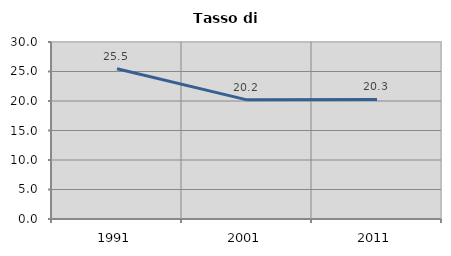
| Category | Tasso di disoccupazione   |
|---|---|
| 1991.0 | 25.463 |
| 2001.0 | 20.195 |
| 2011.0 | 20.26 |